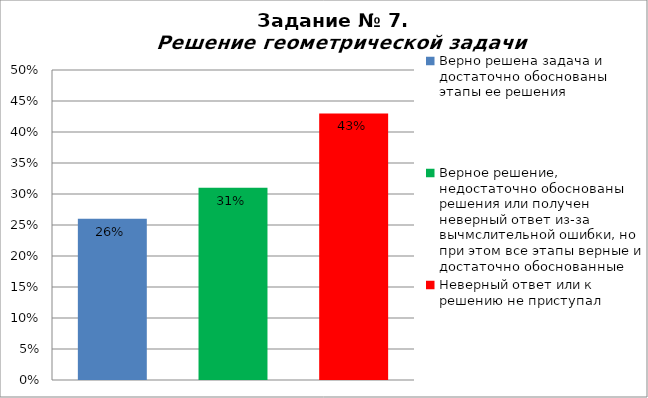
| Category | Решение геометрической задачи  |
|---|---|
| Верно решена задача и достаточно обоснованы этапы ее решения | 0.26 |
| Верное решение, недостаточно обоснованы решения или получен неверный ответ из-за вычмслительной ошибки, но при этом все этапы верные и достаточно обоснованные | 0.31 |
| Неверный ответ или к решению не приступал | 0.43 |